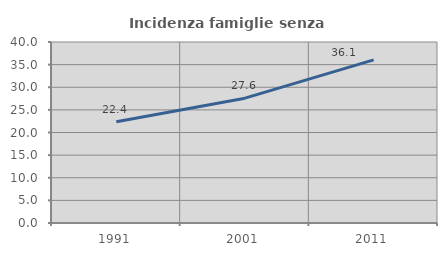
| Category | Incidenza famiglie senza nuclei |
|---|---|
| 1991.0 | 22.372 |
| 2001.0 | 27.589 |
| 2011.0 | 36.051 |